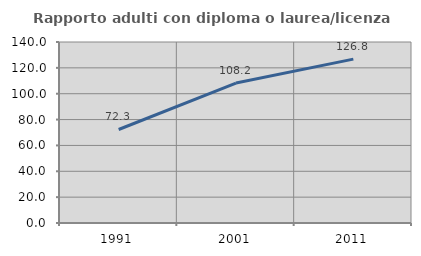
| Category | Rapporto adulti con diploma o laurea/licenza media  |
|---|---|
| 1991.0 | 72.328 |
| 2001.0 | 108.243 |
| 2011.0 | 126.751 |